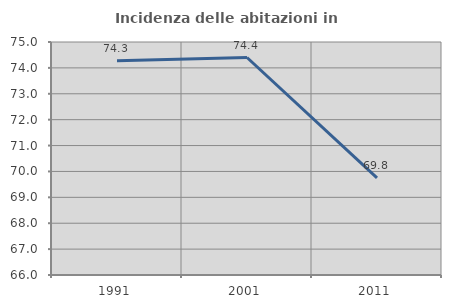
| Category | Incidenza delle abitazioni in proprietà  |
|---|---|
| 1991.0 | 74.278 |
| 2001.0 | 74.401 |
| 2011.0 | 69.752 |